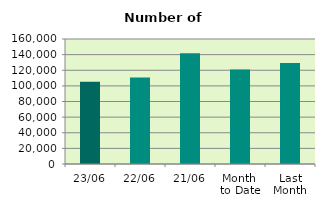
| Category | Series 0 |
|---|---|
| 23/06 | 105230 |
| 22/06 | 110878 |
| 21/06 | 141810 |
| Month 
to Date | 120893.882 |
| Last
Month | 129378.19 |